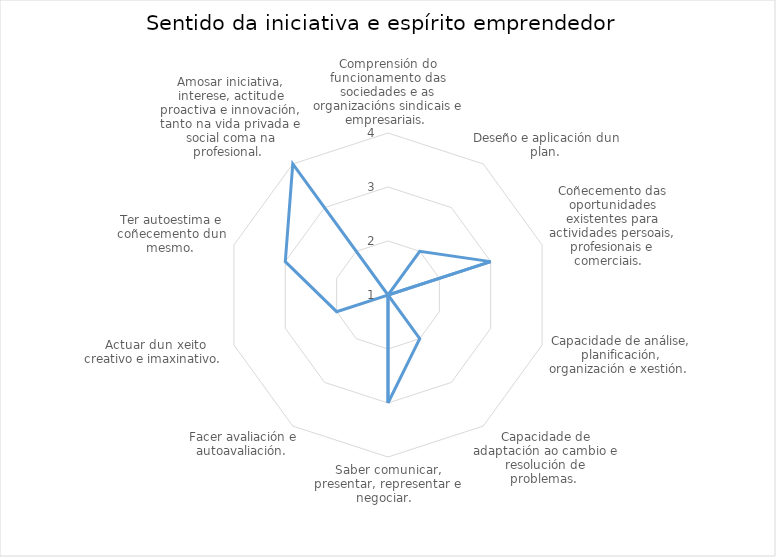
| Category | Series 0 |
|---|---|
| Comprensión do funcionamento das sociedades e as organizacións sindicais e empresariais.  | 1 |
| Deseño e aplicación dun plan.  | 2 |
| Coñecemento das oportunidades existentes para actividades persoais, profesionais e comerciais.   | 3 |
| Capacidade de análise, planificación, organización e xestión.  | 1 |
| Capacidade de adaptación ao cambio e resolución de problemas.  | 2 |
| Saber comunicar, presentar, representar e negociar.   | 3 |
| Facer avaliación e autoavaliación.  | 1 |
| Actuar dun xeito creativo e imaxinativo.  | 2 |
| Ter autoestima e coñecemento dun mesmo.  | 3 |
| Amosar iniciativa, interese, actitude proactiva e innovación, tanto na vida privada e social coma na profesional.  | 4 |